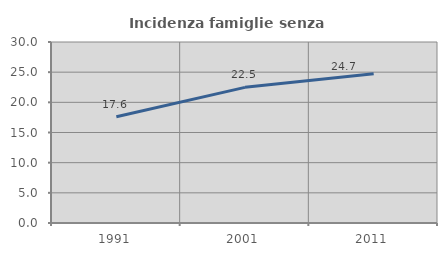
| Category | Incidenza famiglie senza nuclei |
|---|---|
| 1991.0 | 17.609 |
| 2001.0 | 22.484 |
| 2011.0 | 24.726 |